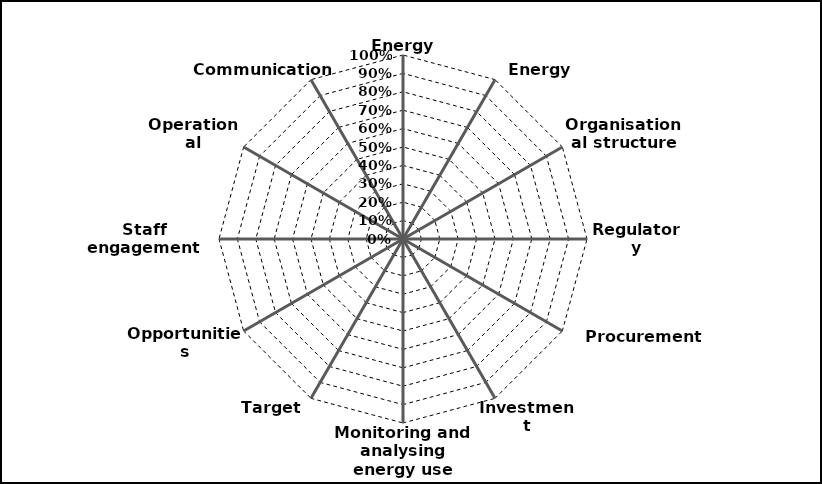
| Category | Series 0 |
|---|---|
| Energy policy | 0 |
| Energy strategy | 0 |
| Organisational structure | 0 |
| Regulatory compliance | 0 |
| Procurement policy | 0 |
| Investment procedures | 0 |
| Monitoring and analysing energy use | 0 |
| Target setting | 0 |
| Opportunities identification | 0 |
| Staff engagement and training | 0 |
| Operational procedures | 0 |
| Communications | 0 |